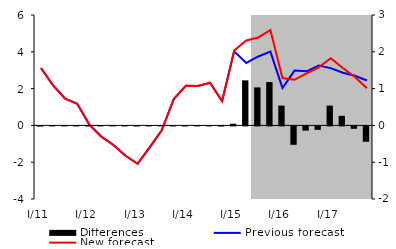
| Category | Differences |
|---|---|
| 0 | -0.005 |
| 1 | 0.003 |
| 2 | 0.001 |
| 3 | 0.002 |
| 4 | -0.003 |
| 5 | 0.003 |
| 6 | 0.001 |
| 7 | 0 |
| 8 | -0.003 |
| 9 | 0.002 |
| 10 | 0.001 |
| 11 | -0.001 |
| 12 | -0.002 |
| 13 | 0.004 |
| 14 | 0.002 |
| 15 | -0.003 |
| 16 | 0.046 |
| 17 | 1.224 |
| 18 | 1.033 |
| 19 | 1.178 |
| 20 | 0.538 |
| 21 | -0.5 |
| 22 | -0.116 |
| 23 | -0.093 |
| 24 | 0.538 |
| 25 | 0.26 |
| 26 | -0.065 |
| 27 | -0.418 |